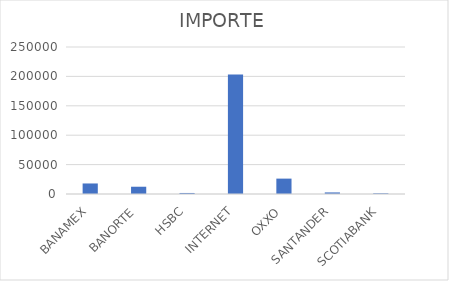
| Category | IMPORTE |
|---|---|
| BANAMEX | 17911.07 |
| BANORTE | 12358.87 |
| HSBC | 1756.78 |
| INTERNET | 203348.17 |
| OXXO | 26161.26 |
| SANTANDER | 2686.95 |
| SCOTIABANK | 1177.84 |